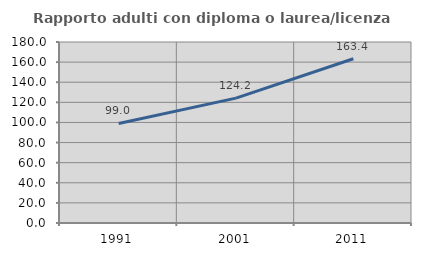
| Category | Rapporto adulti con diploma o laurea/licenza media  |
|---|---|
| 1991.0 | 98.959 |
| 2001.0 | 124.201 |
| 2011.0 | 163.354 |